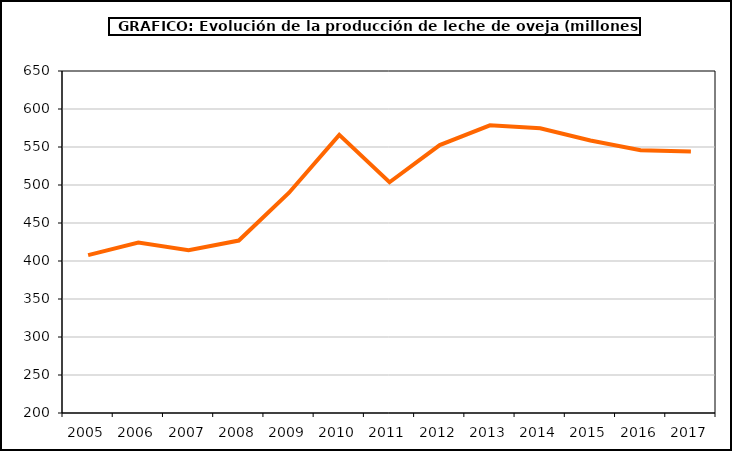
| Category | leche oveja |
|---|---|
| 2005.0 | 407.764 |
| 2006.0 | 424.332 |
| 2007.0 | 414.211 |
| 2008.0 | 426.918 |
| 2009.0 | 489.823 |
| 2010.0 | 565.948 |
| 2011.0 | 503.6 |
| 2012.0 | 552.517 |
| 2013.0 | 578.581 |
| 2014.0 | 574.682 |
| 2015.0 | 558.55 |
| 2016.0 | 545.653 |
| 2017.0 | 544.106 |